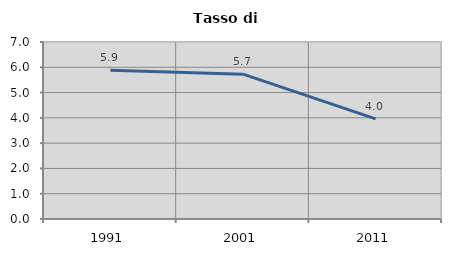
| Category | Tasso di disoccupazione   |
|---|---|
| 1991.0 | 5.882 |
| 2001.0 | 5.729 |
| 2011.0 | 3.96 |